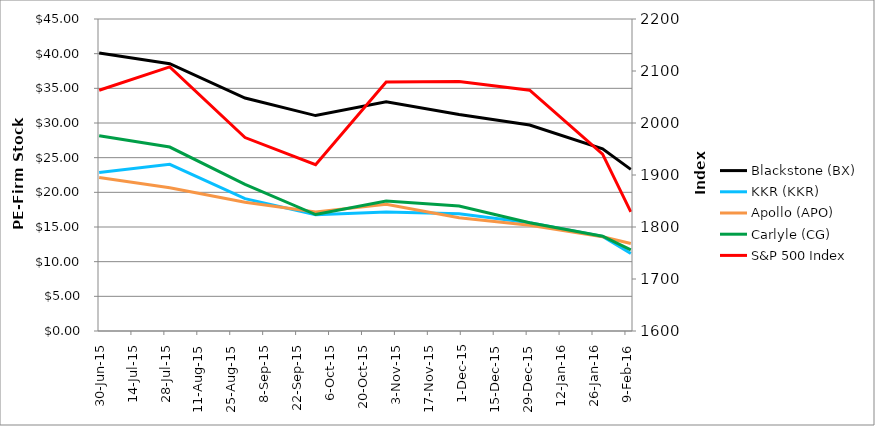
| Category | Blackstone (BX) | KKR (KKR) | Apollo (APO) | Carlyle (CG) |
|---|---|---|---|---|
| 2015-06-30 | 40.1 | 22.85 | 22.15 | 28.15 |
| 2015-07-30 | 38.55 | 24.04 | 20.67 | 26.53 |
| 2015-08-31 | 33.6 | 19.09 | 18.58 | 21.16 |
| 2015-09-30 | 31.07 | 16.78 | 17.18 | 16.8 |
| 2015-10-30 | 33.06 | 17.15 | 18.27 | 18.74 |
| 2015-11-30 | 31.23 | 16.91 | 16.33 | 18.03 |
| 2015-12-30 | 29.71 | 15.61 | 15.25 | 15.62 |
| 2016-01-30 | 26.27 | 13.63 | 13.58 | 13.68 |
| 2016-02-11 | 23.31 | 11.18 | 12.63 | 11.71 |